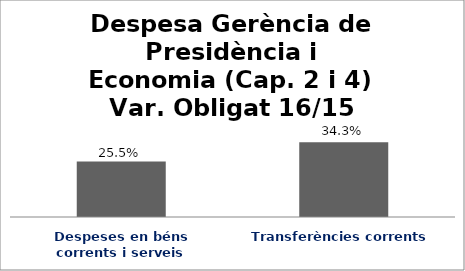
| Category | Series 0 |
|---|---|
| Despeses en béns corrents i serveis | 0.255 |
| Transferències corrents | 0.343 |